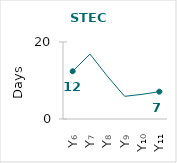
| Category | STEC |
|---|---|
| Y₆ | 12.4 |
| Y₇ | 16.857 |
| Y₈ | 11.125 |
| Y₉ | 5.889 |
| Y₁₀ | 6.4 |
| Y₁₁ | 7.1 |